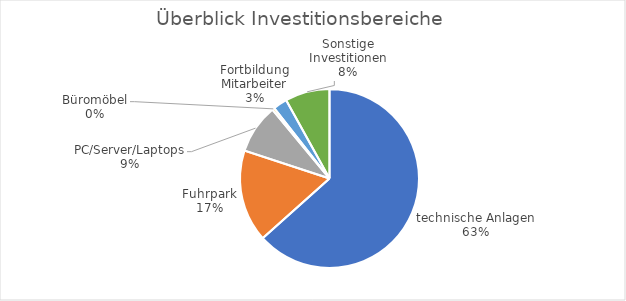
| Category | Series 0 |
|---|---|
| technische Anlagen | 520182 |
| Fuhrpark | 136608 |
| PC/Server/Laptops | 73327.8 |
| Büromöbel | 3515 |
| Fortbildung Mitarbeiter | 20913 |
| Sonstige Investitionen | 66013 |